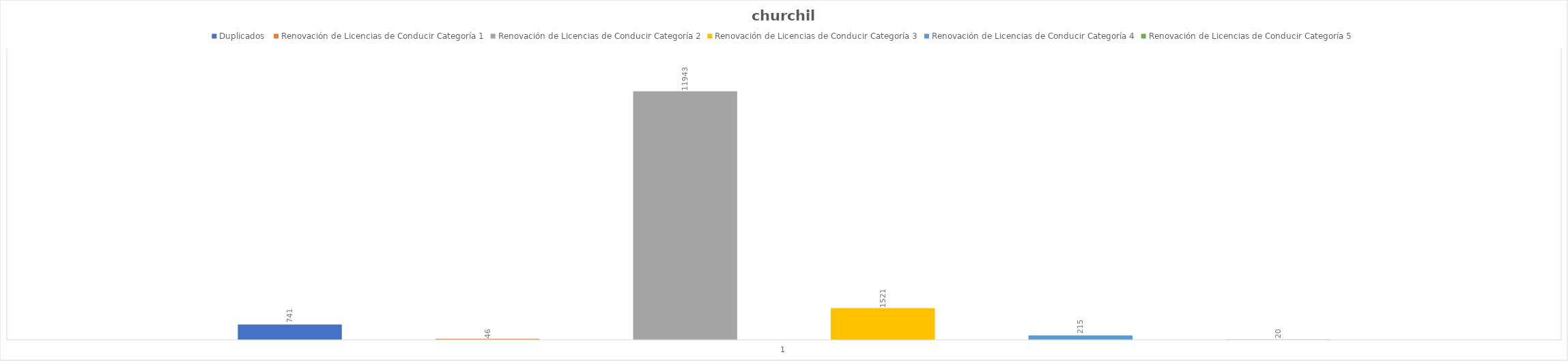
| Category | Duplicados  | Renovación de Licencias de Conducir Categoría 1 | Renovación de Licencias de Conducir Categoría 2 | Renovación de Licencias de Conducir Categoría 3 | Renovación de Licencias de Conducir Categoría 4 | Renovación de Licencias de Conducir Categoría 5 |
|---|---|---|---|---|---|---|
| 0 | 741 | 46 | 11943 | 1521 | 215 | 20 |